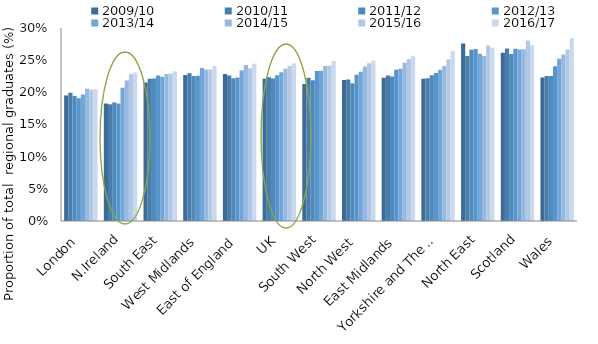
| Category | 2009/10 | 2010/11 | 2011/12 | 2012/13 | 2013/14 | 2014/15 | 2015/16 | 2016/17 |
|---|---|---|---|---|---|---|---|---|
| London | 0.195 | 0.199 | 0.195 | 0.191 | 0.197 | 0.206 | 0.204 | 0.205 |
| N.Ireland | 0.183 | 0.181 | 0.184 | 0.183 | 0.207 | 0.219 | 0.228 | 0.231 |
| South East | 0.215 | 0.221 | 0.222 | 0.226 | 0.224 | 0.229 | 0.229 | 0.233 |
| West Midlands | 0.227 | 0.23 | 0.225 | 0.226 | 0.238 | 0.235 | 0.236 | 0.241 |
| East of England | 0.229 | 0.226 | 0.222 | 0.223 | 0.234 | 0.243 | 0.237 | 0.244 |
| UK | 0.221 | 0.224 | 0.221 | 0.227 | 0.231 | 0.237 | 0.241 | 0.245 |
| South West | 0.213 | 0.223 | 0.219 | 0.233 | 0.233 | 0.241 | 0.241 | 0.249 |
| North West | 0.219 | 0.22 | 0.214 | 0.227 | 0.232 | 0.24 | 0.245 | 0.249 |
| East Midlands | 0.222 | 0.226 | 0.225 | 0.235 | 0.237 | 0.246 | 0.252 | 0.256 |
| Yorkshire and The Humber | 0.221 | 0.222 | 0.227 | 0.23 | 0.235 | 0.241 | 0.252 | 0.264 |
| North East | 0.276 | 0.256 | 0.266 | 0.267 | 0.26 | 0.257 | 0.273 | 0.269 |
| Scotland | 0.261 | 0.268 | 0.26 | 0.268 | 0.267 | 0.267 | 0.28 | 0.273 |
| Wales | 0.223 | 0.225 | 0.225 | 0.241 | 0.252 | 0.259 | 0.266 | 0.284 |